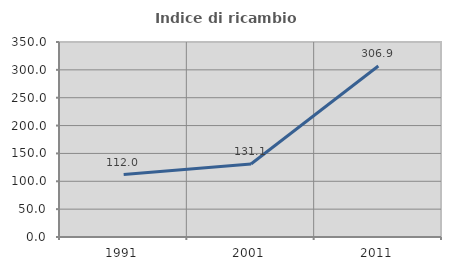
| Category | Indice di ricambio occupazionale  |
|---|---|
| 1991.0 | 112.025 |
| 2001.0 | 131.111 |
| 2011.0 | 306.897 |